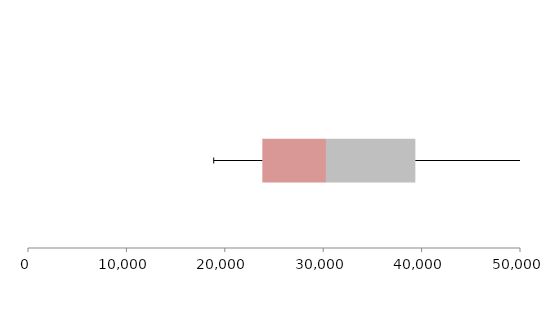
| Category | Series 1 | Series 2 | Series 3 |
|---|---|---|---|
| 0 | 23815.229 | 6464.992 | 9084.541 |